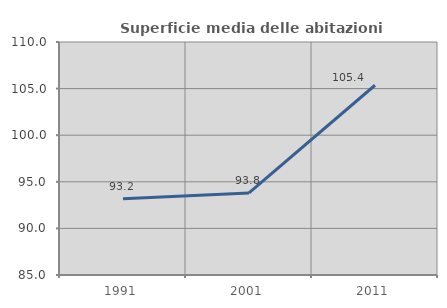
| Category | Superficie media delle abitazioni occupate |
|---|---|
| 1991.0 | 93.193 |
| 2001.0 | 93.811 |
| 2011.0 | 105.358 |